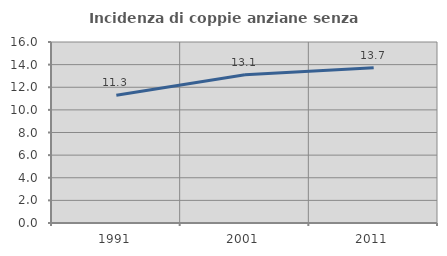
| Category | Incidenza di coppie anziane senza figli  |
|---|---|
| 1991.0 | 11.286 |
| 2001.0 | 13.111 |
| 2011.0 | 13.725 |